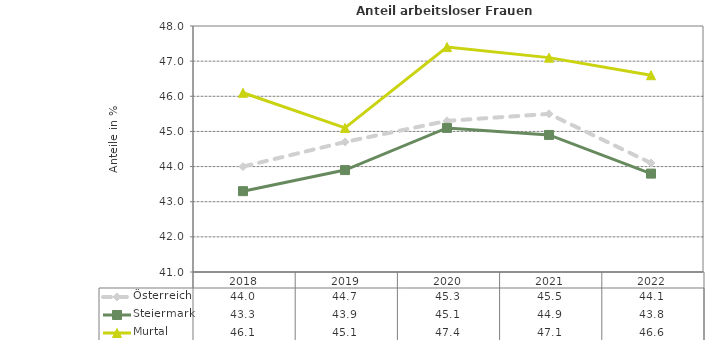
| Category | Österreich | Steiermark | Murtal |
|---|---|---|---|
| 2022.0 | 44.1 | 43.8 | 46.6 |
| 2021.0 | 45.5 | 44.9 | 47.1 |
| 2020.0 | 45.3 | 45.1 | 47.4 |
| 2019.0 | 44.7 | 43.9 | 45.1 |
| 2018.0 | 44 | 43.3 | 46.1 |